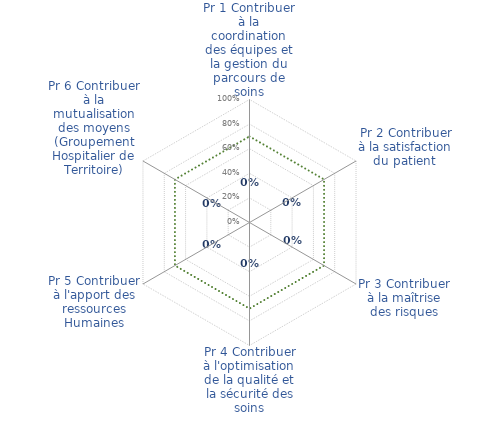
| Category | RADAR pour PROCESSUS & PERFORMANCE | Series 15 |
|---|---|---|
| Pr 1 Contribuer à la coordination des équipes et la gestion du parcours de soins | 0 | 0.7 |
| Pr 2 Contribuer à la satisfaction du patient  | 0 | 0.7 |
| Pr 3 Contribuer à la maîtrise des risques | 0 | 0.7 |
| Pr 4 Contribuer à l'optimisation de la qualité et la sécurité des soins | 0 | 0.7 |
| Pr 5 Contribuer à l'apport des ressources Humaines | 0 | 0.7 |
| Pr 6 Contribuer à la mutualisation des moyens (Groupement Hospitalier de Territoire) | 0 | 0.7 |